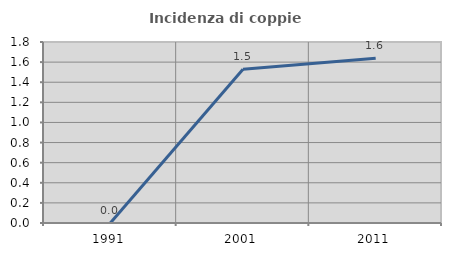
| Category | Incidenza di coppie miste |
|---|---|
| 1991.0 | 0 |
| 2001.0 | 1.529 |
| 2011.0 | 1.639 |